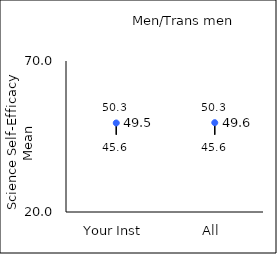
| Category | 25th percentile | 75th percentile | Mean |
|---|---|---|---|
| Your Inst | 45.6 | 50.3 | 49.48 |
| All  | 45.6 | 50.3 | 49.58 |